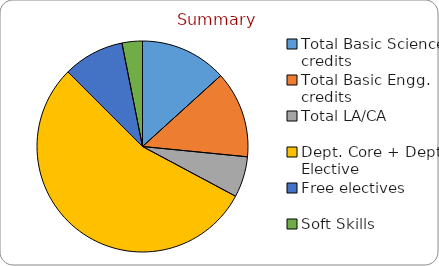
| Category | Series 0 |
|---|---|
| Total Basic Science credits  | 17 |
| Total Basic Engg. credits | 17 |
| Total LA/CA | 8 |
| Dept. Core + Dept. Elective | 70 |
| Free electives | 12 |
| Soft Skills  | 4 |